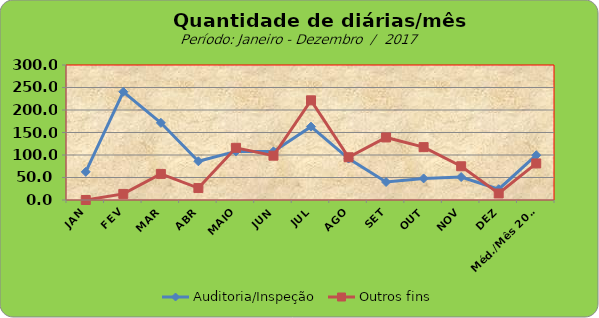
| Category | Auditoria/Inspeção | Outros fins |
|---|---|---|
| JAN | 62.5 | 0 |
| FEV | 240.5 | 13.5 |
| MAR | 171.5 | 58 |
| ABR | 86 | 26.5 |
| MAIO | 108 | 116 |
| JUN | 108 | 98.5 |
| JUL | 163 | 221.5 |
| AGO | 92 | 95 |
| SET | 40 | 139 |
| OUT | 48 | 117.5 |
| NOV | 51 | 75 |
| DEZ | 24 | 14.5 |
| Méd./Mês 2016 | 99.542 | 81.25 |